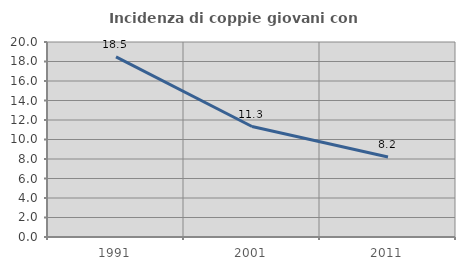
| Category | Incidenza di coppie giovani con figli |
|---|---|
| 1991.0 | 18.473 |
| 2001.0 | 11.331 |
| 2011.0 | 8.205 |